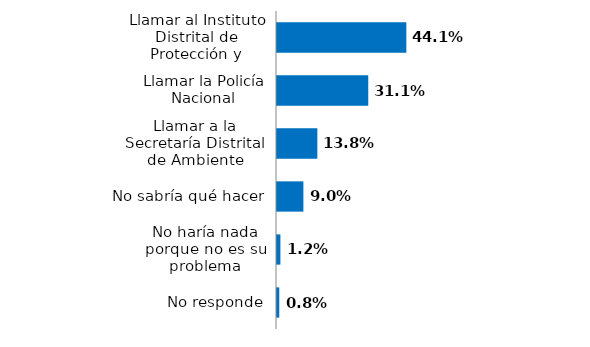
| Category | Series 0 |
|---|---|
| No responde | 0.008 |
| No haría nada porque no es su problema | 0.012 |
| No sabría qué hacer | 0.09 |
| Llamar a la Secretaría Distrital de Ambiente | 0.138 |
| Llamar la Policía Nacional | 0.311 |
| Llamar al Instituto Distrital de Protección y Bienestar Animal | 0.441 |